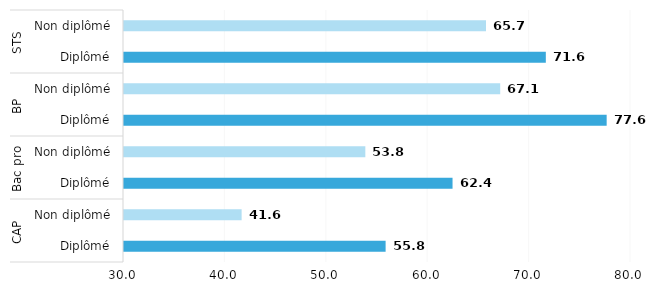
| Category | Series 0 |
|---|---|
| 0 | 55.8 |
| 1 | 41.6 |
| 2 | 62.4 |
| 3 | 53.8 |
| 4 | 77.6 |
| 5 | 67.1 |
| 6 | 71.6 |
| 7 | 65.7 |